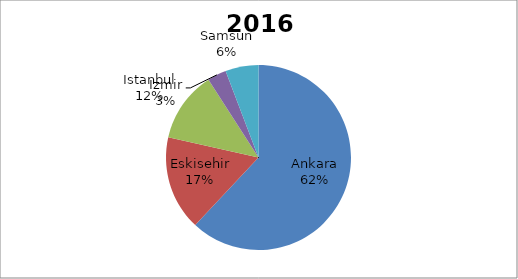
| Category | 2016 |
|---|---|
| Ankara | 75 |
| Eskisehir | 20 |
| Istanbul | 15 |
| Izmir | 4 |
| Samsun | 7 |